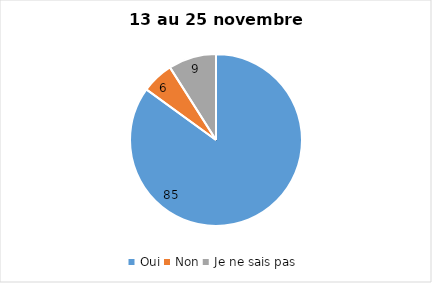
| Category | Series 0 |
|---|---|
| Oui | 85 |
| Non | 6 |
| Je ne sais pas | 9 |